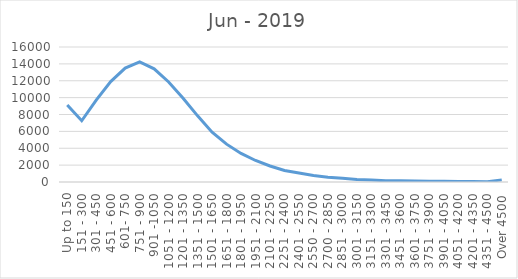
| Category | Jun - 2019 |
|---|---|
| Up to 150 | 9116 |
| 151 - 300 | 7261 |
| 301 - 450 | 9713 |
| 451 - 600 | 11897 |
| 601- 750 | 13500 |
| 751 - 900 | 14240 |
| 901 -1050 | 13416 |
| 1051 - 1200 | 11855 |
| 1201 - 1350 | 9917 |
| 1351 - 1500 | 7839 |
| 1501 - 1650 | 5904 |
| 1651 - 1800 | 4485 |
| 1801 - 1950 | 3385 |
| 1951 - 2100 | 2549 |
| 2101 - 2250 | 1897 |
| 2251 - 2400 | 1364 |
| 2401 - 2550 | 1057 |
| 2550 - 2700 | 761 |
| 2700 - 2850 | 571 |
| 2851 - 3000 | 432 |
| 3001 - 3150 | 302 |
| 3151 - 3300 | 227 |
| 3301 - 3450 | 151 |
| 3451 - 3600 | 139 |
| 3601 - 3750 | 118 |
| 3751 - 3900 | 100 |
| 3901 - 4050 | 79 |
| 4051 - 4200 | 55 |
| 4201 - 4350 | 49 |
| 4351 - 4500 | 43 |
| Over 4500 | 251 |